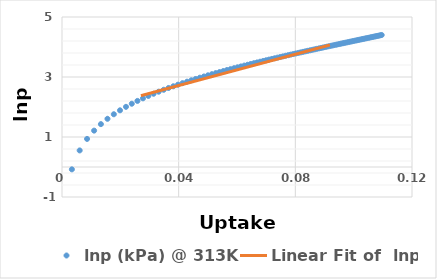
| Category | lnp (kPa) @ 313K |
|---|---|
| 0.00339 | -0.078 |
| 0.00606 | 0.552 |
| 0.00859 | 0.936 |
| 0.01101 | 1.212 |
| 0.01334 | 1.429 |
| 0.01559 | 1.607 |
| 0.01777 | 1.758 |
| 0.01989 | 1.89 |
| 0.02194 | 2.005 |
| 0.02393 | 2.109 |
| 0.02587 | 2.203 |
| 0.02776 | 2.289 |
| 0.0296 | 2.368 |
| 0.0314 | 2.442 |
| 0.03315 | 2.51 |
| 0.03486 | 2.574 |
| 0.03653 | 2.634 |
| 0.03817 | 2.691 |
| 0.03976 | 2.744 |
| 0.04133 | 2.796 |
| 0.04286 | 2.844 |
| 0.04435 | 2.89 |
| 0.04582 | 2.934 |
| 0.04726 | 2.977 |
| 0.04866 | 3.017 |
| 0.05004 | 3.056 |
| 0.05139 | 3.094 |
| 0.05272 | 3.13 |
| 0.05402 | 3.165 |
| 0.0553 | 3.199 |
| 0.05655 | 3.231 |
| 0.05778 | 3.263 |
| 0.05899 | 3.294 |
| 0.06017 | 3.323 |
| 0.06134 | 3.352 |
| 0.06248 | 3.38 |
| 0.06361 | 3.408 |
| 0.06472 | 3.434 |
| 0.0658 | 3.46 |
| 0.06687 | 3.485 |
| 0.06792 | 3.51 |
| 0.06896 | 3.534 |
| 0.06997 | 3.557 |
| 0.07097 | 3.58 |
| 0.07196 | 3.603 |
| 0.07293 | 3.625 |
| 0.07388 | 3.646 |
| 0.07482 | 3.667 |
| 0.07575 | 3.688 |
| 0.07666 | 3.708 |
| 0.07756 | 3.728 |
| 0.07844 | 3.747 |
| 0.07931 | 3.766 |
| 0.08017 | 3.784 |
| 0.08102 | 3.803 |
| 0.08185 | 3.821 |
| 0.08267 | 3.838 |
| 0.08348 | 3.856 |
| 0.08428 | 3.873 |
| 0.08507 | 3.89 |
| 0.08584 | 3.906 |
| 0.08661 | 3.922 |
| 0.08736 | 3.938 |
| 0.08811 | 3.954 |
| 0.08885 | 3.97 |
| 0.08957 | 3.985 |
| 0.09029 | 4 |
| 0.09099 | 4.014 |
| 0.09169 | 4.029 |
| 0.09238 | 4.043 |
| 0.09306 | 4.058 |
| 0.09373 | 4.071 |
| 0.09439 | 4.085 |
| 0.09505 | 4.099 |
| 0.09569 | 4.112 |
| 0.09633 | 4.125 |
| 0.09696 | 4.138 |
| 0.09759 | 4.151 |
| 0.0982 | 4.164 |
| 0.09881 | 4.177 |
| 0.09941 | 4.189 |
| 0.1 | 4.201 |
| 0.10059 | 4.213 |
| 0.10117 | 4.225 |
| 0.10174 | 4.237 |
| 0.10231 | 4.249 |
| 0.10287 | 4.26 |
| 0.10342 | 4.272 |
| 0.10397 | 4.283 |
| 0.10451 | 4.294 |
| 0.10504 | 4.305 |
| 0.10557 | 4.316 |
| 0.10609 | 4.327 |
| 0.10661 | 4.338 |
| 0.10712 | 4.348 |
| 0.10763 | 4.359 |
| 0.10813 | 4.369 |
| 0.10862 | 4.379 |
| 0.10911 | 4.389 |
| 0.1096 | 4.4 |